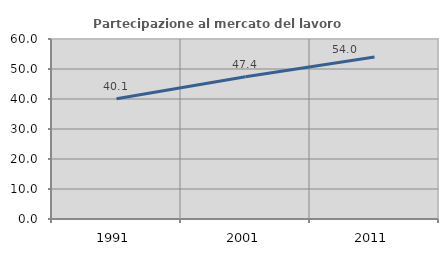
| Category | Partecipazione al mercato del lavoro  femminile |
|---|---|
| 1991.0 | 40.067 |
| 2001.0 | 47.387 |
| 2011.0 | 54.026 |